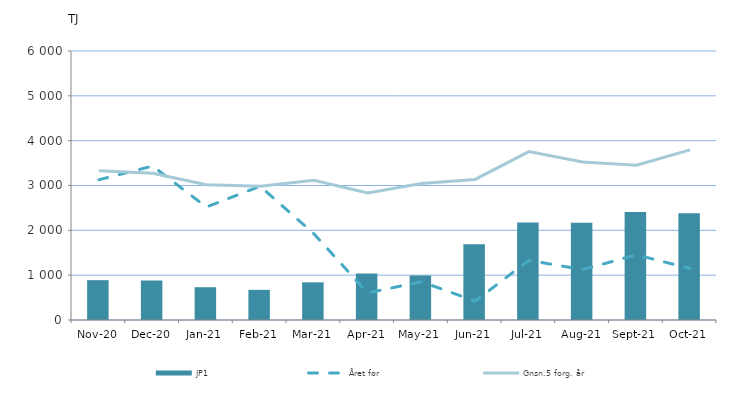
| Category | JP1 |
|---|---|
| 2020-11-01 | 888.583 |
| 2020-12-01 | 881.066 |
| 2021-01-01 | 731.461 |
| 2021-02-01 | 672.44 |
| 2021-03-01 | 839.898 |
| 2021-04-01 | 1038.362 |
| 2021-05-01 | 992.357 |
| 2021-06-01 | 1691.141 |
| 2021-07-01 | 2173.956 |
| 2021-08-01 | 2167.17 |
| 2021-09-01 | 2411.675 |
| 2021-10-01 | 2383.8 |